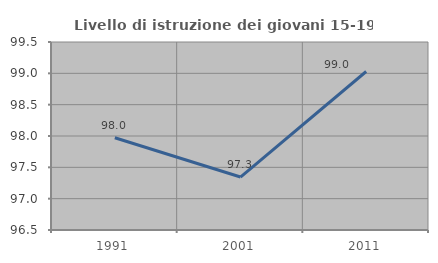
| Category | Livello di istruzione dei giovani 15-19 anni |
|---|---|
| 1991.0 | 97.973 |
| 2001.0 | 97.345 |
| 2011.0 | 99.029 |